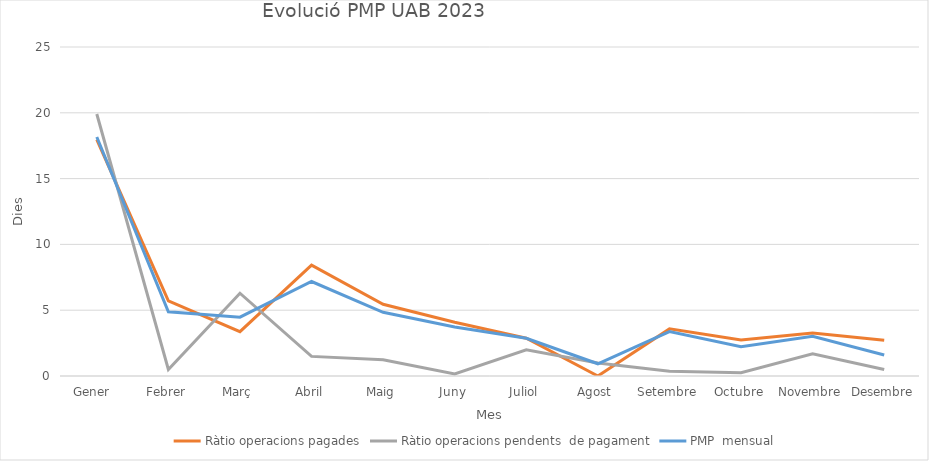
| Category | Ràtio operacions pagades | Ràtio operacions pendents  de pagament | PMP  mensual |
|---|---|---|---|
| Gener  | 17.96 | 19.91 | 18.16 |
| Febrer | 5.71 | 0.5 | 4.88 |
| Març | 3.37 | 6.29 | 4.47 |
| Abril | 8.43 | 1.49 | 7.18 |
| Maig | 5.45 | 1.23 | 4.84 |
| Juny | 4.08 | 0.16 | 3.72 |
| Juliol | 2.87 | 1.99 | 2.87 |
| Agost | 0 | 0.99 | 0.93 |
| Setembre | 3.58 | 0.36 | 3.38 |
| Octubre | 2.73 | 0.25 | 2.22 |
| Novembre | 3.27 | 1.69 | 3.02 |
| Desembre | 2.72 | 0.49 | 1.6 |